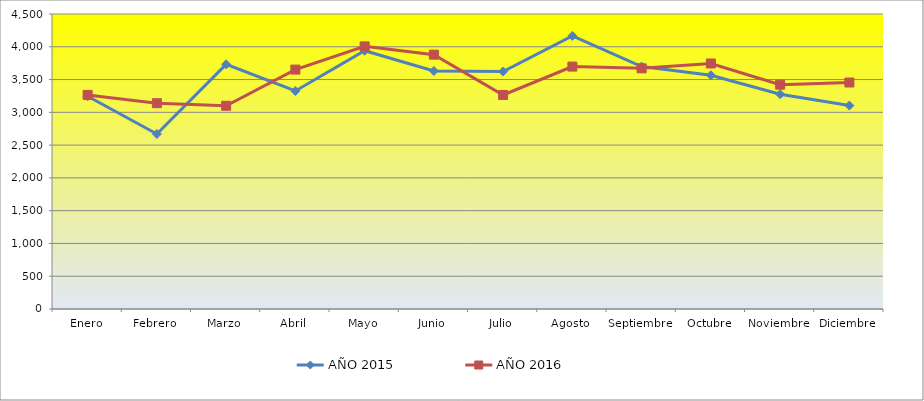
| Category | AÑO 2015 | AÑO 2016 |
|---|---|---|
| Enero | 3245 | 3266 |
| Febrero | 2670 | 3139 |
| Marzo | 3732 | 3100 |
| Abril | 3326 | 3652 |
| Mayo | 3940 | 4006 |
| Junio | 3631 | 3880 |
| Julio | 3623 | 3265 |
| Agosto | 4166 | 3698 |
| Septiembre | 3699 | 3671 |
| Octubre | 3566 | 3745 |
| Noviembre | 3277 | 3422 |
| Diciembre | 3103 | 3455 |